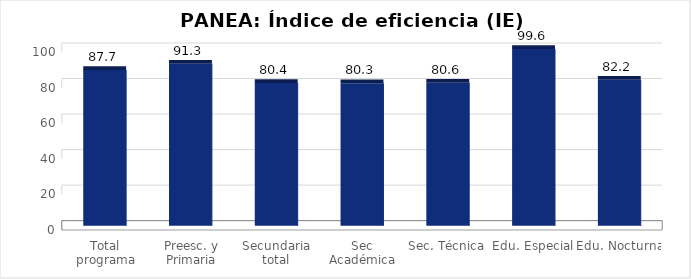
| Category | Índice de eficiencia (IE)  |
|---|---|
| Total programa | 87.701 |
| Preesc. y Primaria | 91.323 |
| Secundaria total | 80.386 |
| Sec Académica | 80.271 |
| Sec. Técnica | 80.598 |
| Edu. Especial | 99.607 |
| Edu. Nocturna | 82.246 |